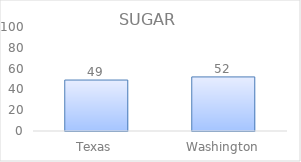
| Category | Series 0 |
|---|---|
| Texas | 49 |
| Washington | 52 |